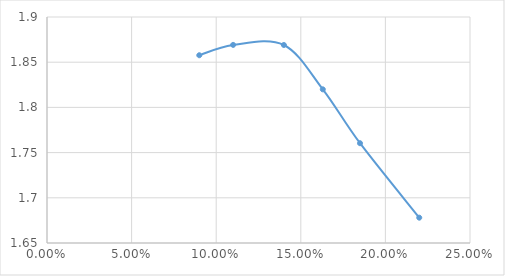
| Category | Series 0 |
|---|---|
| 0.09 | 1.858 |
| 0.11 | 1.869 |
| 0.14 | 1.869 |
| 0.163 | 1.82 |
| 0.185 | 1.76 |
| 0.22 | 1.678 |